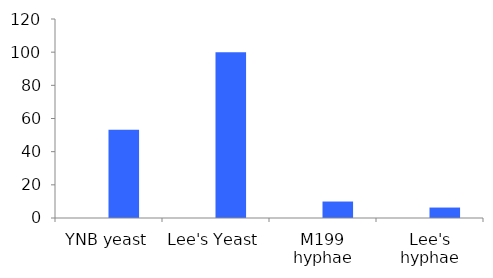
| Category | Series 0 | Series 1 |
|---|---|---|
| YNB yeast |  | 53.173 |
| Lee's Yeast |  | 100 |
| M199 hyphae |  | 9.93 |
| Lee's hyphae |  | 6.303 |